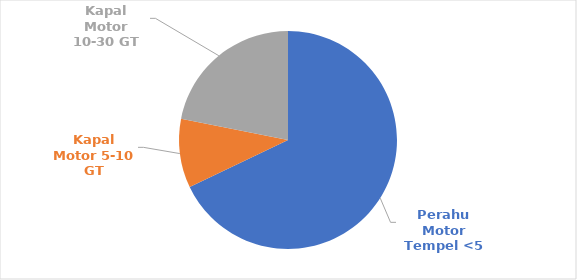
| Category | Series 0 |
|---|---|
| Perahu Motor Tempel <5 | 239 |
| Kapal Motor 5-10 GT | 36 |
| Kapal Motor 10-30 GT | 77 |